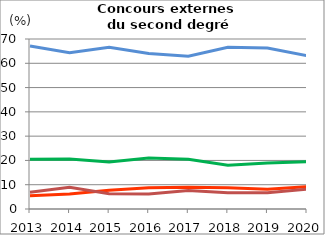
| Category | Étudiants | Enseignants et personnels d'éducation et de surveillance                            | Autres emplois dans secteurs public ou privé                | Sans emploi                    |
|---|---|---|---|---|
| 2013.0 | 67.1 | 20.5 | 5.5 | 6.9 |
| 2014.0 | 64.3 | 20.6 | 6.2 | 8.9 |
| 2015.0 | 66.6 | 19.4 | 7.7 | 6.3 |
| 2016.0 | 64 | 21 | 8.8 | 6.2 |
| 2017.0 | 62.9 | 20.5 | 9 | 7.6 |
| 2018.0 | 66.6 | 18 | 8.7 | 6.7 |
| 2019.0 | 66.3 | 18.9 | 8.1 | 6.7 |
| 2020.0 | 63.1 | 19.5 | 9.2 | 8.2 |